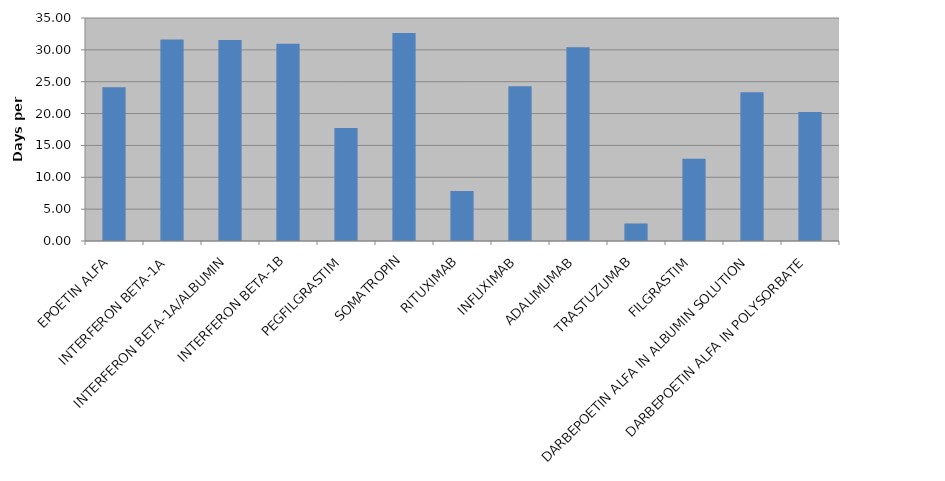
| Category | Total |
|---|---|
| EPOETIN ALFA | 24.136 |
| INTERFERON BETA-1A | 31.628 |
| INTERFERON BETA-1A/ALBUMIN | 31.543 |
| INTERFERON BETA-1B | 30.939 |
| PEGFILGRASTIM | 17.728 |
| SOMATROPIN | 32.65 |
| RITUXIMAB | 7.863 |
| INFLIXIMAB | 24.293 |
| ADALIMUMAB | 30.422 |
| TRASTUZUMAB | 2.751 |
| FILGRASTIM | 12.903 |
| DARBEPOETIN ALFA IN ALBUMIN SOLUTION | 23.333 |
| DARBEPOETIN ALFA IN POLYSORBATE | 20.247 |